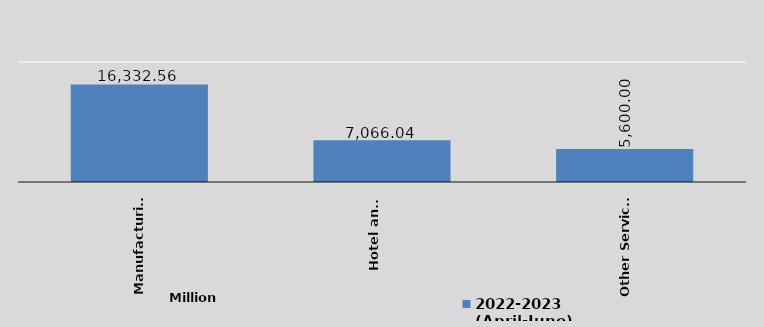
| Category | 2022-2023 
(April-June)
 |
|---|---|
| Manufacturing | 16332.56 |
| Hotel and 
Tourism | 7066.04 |
| Other Services | 5600 |